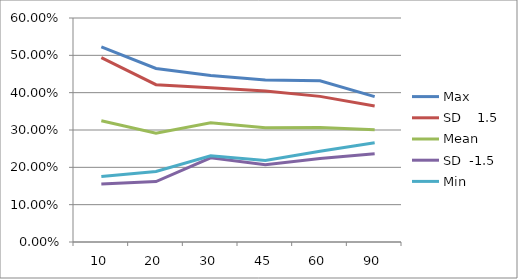
| Category | Max | SD    1.5 | Mean | SD  -1.5 | Min |
|---|---|---|---|---|---|
| 10.0 | 0.523 | 0.494 | 0.325 | 0.155 | 0.175 |
| 20.0 | 0.465 | 0.421 | 0.292 | 0.162 | 0.189 |
| 30.0 | 0.446 | 0.413 | 0.319 | 0.225 | 0.231 |
| 45.0 | 0.434 | 0.404 | 0.306 | 0.207 | 0.218 |
| 60.0 | 0.432 | 0.39 | 0.307 | 0.224 | 0.243 |
| 90.0 | 0.389 | 0.364 | 0.3 | 0.237 | 0.266 |